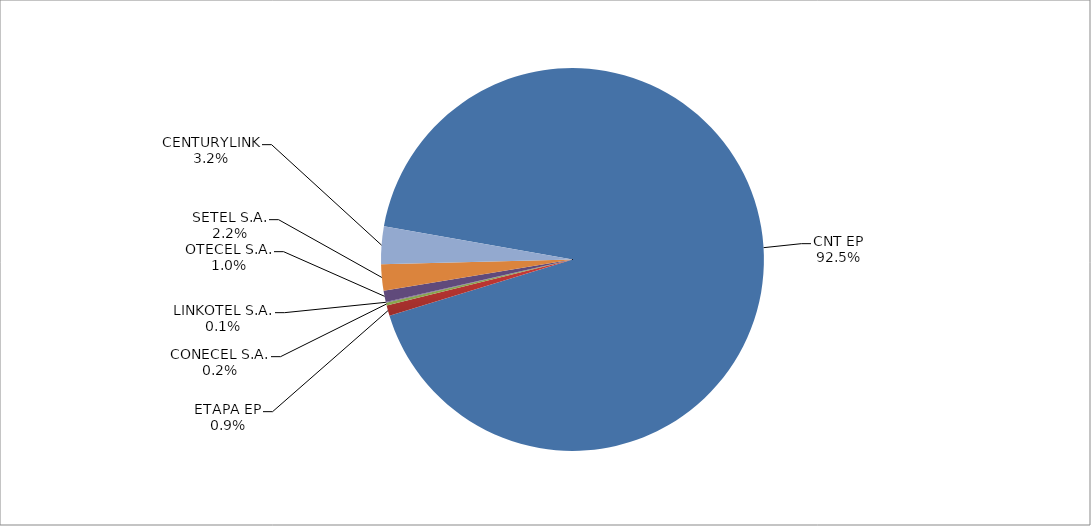
| Category | Series 0 |
|---|---|
| CNT EP | 2716 |
| ETAPA EP | 26 |
| CONECEL S.A. | 7 |
| LINKOTEL S.A. | 2 |
| OTECEL S.A. | 28 |
| SETEL S.A. | 65 |
| CENTURYLINK | 93 |